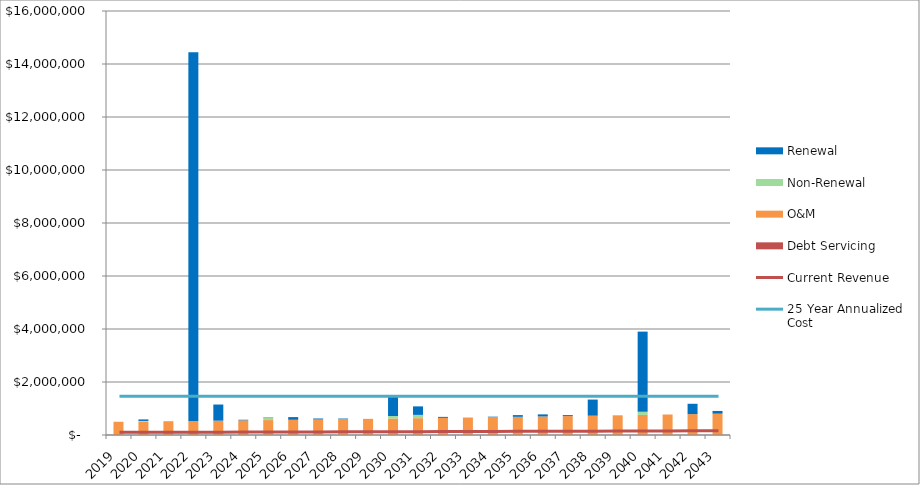
| Category | Debt Servicing | O&M | Non-Renewal | Renewal |
|---|---|---|---|---|
| 2019.0 | 1 | 500000 | 0 | 0 |
| 2020.0 | 1 | 510000 | 20000 | 58040.316 |
| 2021.0 | 1 | 520200 | 0 | 0 |
| 2022.0 | 1 | 530604 | 0 | 13912356.928 |
| 2023.0 | 1 | 541216.08 | 0 | 608472.972 |
| 2024.0 | 1 | 552040.402 | 0 | 23040.316 |
| 2025.0 | 1 | 563081.21 | 100000 | 10839.387 |
| 2026.0 | 1 | 574342.834 | 0 | 100941.029 |
| 2027.0 | 1 | 585829.691 | 0 | 36816.611 |
| 2028.0 | 1 | 597546.284 | 0 | 23040.316 |
| 2029.0 | 1 | 609497.21 | 0 | 0 |
| 2030.0 | 1 | 621687.154 | 95000 | 733040.316 |
| 2031.0 | 1 | 634120.897 | 125000 | 321038.98 |
| 2032.0 | 1 | 646803.315 | 0 | 36816.611 |
| 2033.0 | 1 | 659739.382 | 0 | 0 |
| 2034.0 | 1 | 672934.169 | 0 | 18525 |
| 2035.0 | 1 | 686392.853 | 0 | 64594.557 |
| 2036.0 | 1 | 700120.71 | 0 | 77900.713 |
| 2037.0 | 1 | 714123.124 | 0 | 36816.611 |
| 2038.0 | 1 | 728405.586 | 0 | 608472.972 |
| 2039.0 | 1 | 742973.698 | 0 | 0 |
| 2040.0 | 1 | 757833.172 | 120000 | 3023039.038 |
| 2041.0 | 1 | 772989.835 | 0 | 0 |
| 2042.0 | 1 | 788449.632 | 0 | 389316.611 |
| 2043.0 | 1 | 804218.625 | 0 | 102977.674 |